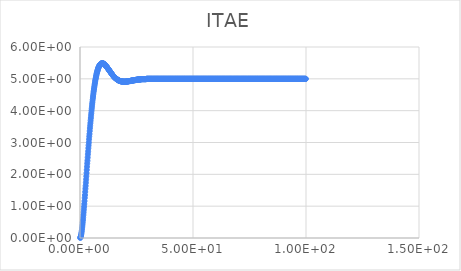
| Category | Series 0 |
|---|---|
| 0.1 | 0.004 |
| 0.2 | 0.016 |
| 0.3 | 0.036 |
| 0.4 | 0.064 |
| 0.5 | 0.098 |
| 0.6 | 0.138 |
| 0.7 | 0.184 |
| 0.8 | 0.236 |
| 0.9 | 0.293 |
| 1.0 | 0.354 |
| 1.1 | 0.42 |
| 1.2 | 0.491 |
| 1.3 | 0.565 |
| 1.4 | 0.642 |
| 1.5 | 0.723 |
| 1.6 | 0.806 |
| 1.7 | 0.892 |
| 1.8 | 0.98 |
| 1.9 | 1.07 |
| 2.0 | 1.16 |
| 2.1 | 1.26 |
| 2.2 | 1.35 |
| 2.3 | 1.45 |
| 2.4 | 1.55 |
| 2.5 | 1.64 |
| 2.6 | 1.74 |
| 2.7 | 1.84 |
| 2.8 | 1.94 |
| 2.9 | 2.04 |
| 3.0 | 2.14 |
| 3.1 | 2.24 |
| 3.2 | 2.34 |
| 3.3 | 2.43 |
| 3.4 | 2.53 |
| 3.5 | 2.63 |
| 3.6 | 2.72 |
| 3.7 | 2.82 |
| 3.8 | 2.91 |
| 3.9 | 3 |
| 4.0 | 3.1 |
| 4.1 | 3.19 |
| 4.2 | 3.27 |
| 4.3 | 3.36 |
| 4.4 | 3.45 |
| 4.5 | 3.53 |
| 4.6 | 3.61 |
| 4.7 | 3.69 |
| 4.8 | 3.77 |
| 4.9 | 3.85 |
| 5.0 | 3.92 |
| 5.1 | 4 |
| 5.2 | 4.07 |
| 5.3 | 4.14 |
| 5.4 | 4.21 |
| 5.5 | 4.27 |
| 5.6 | 4.34 |
| 5.7 | 4.4 |
| 5.8 | 4.46 |
| 5.9 | 4.52 |
| 6.0 | 4.58 |
| 6.1 | 4.63 |
| 6.2 | 4.68 |
| 6.3 | 4.73 |
| 6.4 | 4.78 |
| 6.5 | 4.83 |
| 6.6 | 4.87 |
| 6.7 | 4.92 |
| 6.8 | 4.96 |
| 6.9 | 5 |
| 7.0 | 5.03 |
| 7.1 | 5.07 |
| 7.2 | 5.1 |
| 7.3 | 5.14 |
| 7.4 | 5.17 |
| 7.5 | 5.2 |
| 7.6 | 5.22 |
| 7.7 | 5.25 |
| 7.8 | 5.27 |
| 7.9 | 5.3 |
| 8.0 | 5.32 |
| 8.1 | 5.34 |
| 8.2 | 5.36 |
| 8.3 | 5.37 |
| 8.4 | 5.39 |
| 8.5 | 5.4 |
| 8.6 | 5.42 |
| 8.7 | 5.43 |
| 8.8 | 5.44 |
| 8.9 | 5.45 |
| 9.0 | 5.46 |
| 9.1 | 5.46 |
| 9.2 | 5.47 |
| 9.3 | 5.47 |
| 9.4 | 5.48 |
| 9.5 | 5.48 |
| 9.6 | 5.48 |
| 9.7 | 5.49 |
| 9.8 | 5.49 |
| 9.9 | 5.49 |
| 10.0 | 5.49 |
| 10.1 | 5.48 |
| 10.2 | 5.48 |
| 10.3 | 5.48 |
| 10.4 | 5.48 |
| 10.5 | 5.47 |
| 10.6 | 5.47 |
| 10.7 | 5.46 |
| 10.8 | 5.46 |
| 10.9 | 5.45 |
| 11.0 | 5.44 |
| 11.1 | 5.44 |
| 11.2 | 5.43 |
| 11.3 | 5.42 |
| 11.4 | 5.41 |
| 11.5 | 5.4 |
| 11.6 | 5.39 |
| 11.7 | 5.39 |
| 11.8 | 5.38 |
| 11.9 | 5.37 |
| 12.0 | 5.36 |
| 12.1 | 5.35 |
| 12.2 | 5.34 |
| 12.3 | 5.33 |
| 12.4 | 5.32 |
| 12.5 | 5.31 |
| 12.6 | 5.3 |
| 12.7 | 5.29 |
| 12.8 | 5.28 |
| 12.9 | 5.27 |
| 13.0 | 5.26 |
| 13.1 | 5.25 |
| 13.2 | 5.24 |
| 13.3 | 5.23 |
| 13.4 | 5.22 |
| 13.5 | 5.21 |
| 13.6 | 5.2 |
| 13.7 | 5.19 |
| 13.8 | 5.18 |
| 13.9 | 5.17 |
| 14.0 | 5.16 |
| 14.1 | 5.15 |
| 14.2 | 5.14 |
| 14.3 | 5.13 |
| 14.4 | 5.12 |
| 14.5 | 5.11 |
| 14.6 | 5.1 |
| 14.7 | 5.09 |
| 14.8 | 5.09 |
| 14.9 | 5.08 |
| 15.0 | 5.07 |
| 15.1 | 5.06 |
| 15.2 | 5.05 |
| 15.3 | 5.05 |
| 15.4 | 5.04 |
| 15.5 | 5.03 |
| 15.6 | 5.03 |
| 15.7 | 5.02 |
| 15.8 | 5.01 |
| 15.9 | 5.01 |
| 16.0 | 5 |
| 16.1 | 5 |
| 16.2 | 4.99 |
| 16.3 | 4.99 |
| 16.4 | 4.98 |
| 16.5 | 4.98 |
| 16.6 | 4.97 |
| 16.7 | 4.97 |
| 16.8 | 4.96 |
| 16.9 | 4.96 |
| 17.0 | 4.95 |
| 17.1 | 4.95 |
| 17.2 | 4.95 |
| 17.3 | 4.94 |
| 17.4 | 4.94 |
| 17.5 | 4.94 |
| 17.6 | 4.93 |
| 17.7 | 4.93 |
| 17.8 | 4.93 |
| 17.9 | 4.93 |
| 18.0 | 4.93 |
| 18.1 | 4.92 |
| 18.2 | 4.92 |
| 18.3 | 4.92 |
| 18.4 | 4.92 |
| 18.5 | 4.92 |
| 18.6 | 4.92 |
| 18.7 | 4.92 |
| 18.8 | 4.91 |
| 18.9 | 4.91 |
| 19.0 | 4.91 |
| 19.1 | 4.91 |
| 19.2 | 4.91 |
| 19.3 | 4.91 |
| 19.4 | 4.91 |
| 19.5 | 4.91 |
| 19.6 | 4.91 |
| 19.7 | 4.91 |
| 19.8 | 4.91 |
| 19.9 | 4.91 |
| 20.0 | 4.91 |
| 20.1 | 4.91 |
| 20.2 | 4.91 |
| 20.3 | 4.91 |
| 20.4 | 4.91 |
| 20.5 | 4.91 |
| 20.6 | 4.91 |
| 20.7 | 4.92 |
| 20.8 | 4.92 |
| 20.9 | 4.92 |
| 21.0 | 4.92 |
| 21.1 | 4.92 |
| 21.2 | 4.92 |
| 21.3 | 4.92 |
| 21.4 | 4.92 |
| 21.5 | 4.92 |
| 21.6 | 4.93 |
| 21.7 | 4.93 |
| 21.8 | 4.93 |
| 21.9 | 4.93 |
| 22.0 | 4.93 |
| 22.1 | 4.93 |
| 22.2 | 4.93 |
| 22.3 | 4.93 |
| 22.4 | 4.94 |
| 22.5 | 4.94 |
| 22.6 | 4.94 |
| 22.7 | 4.94 |
| 22.8 | 4.94 |
| 22.9 | 4.94 |
| 23.0 | 4.94 |
| 23.1 | 4.95 |
| 23.2 | 4.95 |
| 23.3 | 4.95 |
| 23.4 | 4.95 |
| 23.5 | 4.95 |
| 23.6 | 4.95 |
| 23.7 | 4.95 |
| 23.8 | 4.95 |
| 23.9 | 4.96 |
| 24.0 | 4.96 |
| 24.1 | 4.96 |
| 24.2 | 4.96 |
| 24.3 | 4.96 |
| 24.4 | 4.96 |
| 24.5 | 4.96 |
| 24.6 | 4.96 |
| 24.7 | 4.97 |
| 24.8 | 4.97 |
| 24.9 | 4.97 |
| 25.0 | 4.97 |
| 25.1 | 4.97 |
| 25.2 | 4.97 |
| 25.3 | 4.97 |
| 25.4 | 4.97 |
| 25.5 | 4.97 |
| 25.6 | 4.98 |
| 25.7 | 4.98 |
| 25.8 | 4.98 |
| 25.9 | 4.98 |
| 26.0 | 4.98 |
| 26.1 | 4.98 |
| 26.2 | 4.98 |
| 26.3 | 4.98 |
| 26.4 | 4.98 |
| 26.5 | 4.98 |
| 26.6 | 4.98 |
| 26.7 | 4.98 |
| 26.8 | 4.98 |
| 26.9 | 4.99 |
| 27.0 | 4.99 |
| 27.1 | 4.99 |
| 27.2 | 4.99 |
| 27.3 | 4.99 |
| 27.4 | 4.99 |
| 27.5 | 4.99 |
| 27.6 | 4.99 |
| 27.7 | 4.99 |
| 27.8 | 4.99 |
| 27.9 | 4.99 |
| 28.0 | 4.99 |
| 28.1 | 4.99 |
| 28.2 | 4.99 |
| 28.3 | 4.99 |
| 28.4 | 4.99 |
| 28.5 | 4.99 |
| 28.6 | 4.99 |
| 28.7 | 4.99 |
| 28.8 | 4.99 |
| 28.9 | 4.99 |
| 29.0 | 4.99 |
| 29.1 | 4.99 |
| 29.2 | 4.99 |
| 29.3 | 4.99 |
| 29.4 | 5 |
| 29.5 | 5 |
| 29.6 | 5 |
| 29.7 | 5 |
| 29.8 | 5 |
| 29.9 | 5 |
| 30.0 | 5 |
| 30.1 | 5 |
| 30.2 | 5 |
| 30.3 | 5 |
| 30.4 | 5 |
| 30.5 | 5 |
| 30.6 | 5 |
| 30.7 | 5 |
| 30.8 | 5 |
| 30.9 | 5 |
| 31.0 | 5 |
| 31.1 | 5 |
| 31.2 | 5 |
| 31.3 | 5 |
| 31.4 | 5 |
| 31.5 | 5 |
| 31.6 | 5 |
| 31.7 | 5 |
| 31.8 | 5 |
| 31.9 | 5 |
| 32.0 | 5 |
| 32.1 | 5 |
| 32.2 | 5 |
| 32.3 | 5 |
| 32.4 | 5 |
| 32.5 | 5 |
| 32.6 | 5 |
| 32.7 | 5 |
| 32.8 | 5 |
| 32.9 | 5 |
| 33.0 | 5 |
| 33.1 | 5 |
| 33.2 | 5 |
| 33.3 | 5 |
| 33.4 | 5 |
| 33.5 | 5 |
| 33.6 | 5 |
| 33.7 | 5 |
| 33.8 | 5 |
| 33.9 | 5 |
| 34.0 | 5 |
| 34.1 | 5 |
| 34.2 | 5 |
| 34.3 | 5 |
| 34.4 | 5 |
| 34.5 | 5 |
| 34.6 | 5 |
| 34.7 | 5 |
| 34.8 | 5 |
| 34.9 | 5 |
| 35.0 | 5 |
| 35.1 | 5 |
| 35.2 | 5 |
| 35.3 | 5 |
| 35.4 | 5 |
| 35.5 | 5 |
| 35.6 | 5 |
| 35.7 | 5 |
| 35.8 | 5 |
| 35.9 | 5 |
| 36.0 | 5 |
| 36.1 | 5 |
| 36.2 | 5 |
| 36.3 | 5 |
| 36.4 | 5 |
| 36.5 | 5 |
| 36.6 | 5 |
| 36.7 | 5 |
| 36.8 | 5 |
| 36.9 | 5 |
| 37.0 | 5 |
| 37.1 | 5 |
| 37.2 | 5 |
| 37.3 | 5 |
| 37.4 | 5 |
| 37.5 | 5 |
| 37.6 | 5 |
| 37.7 | 5 |
| 37.8 | 5 |
| 37.9 | 5 |
| 38.0 | 5 |
| 38.1 | 5 |
| 38.2 | 5 |
| 38.3 | 5 |
| 38.4 | 5 |
| 38.5 | 5 |
| 38.6 | 5 |
| 38.7 | 5 |
| 38.8 | 5 |
| 38.9 | 5 |
| 39.0 | 5 |
| 39.1 | 5 |
| 39.2 | 5 |
| 39.3 | 5 |
| 39.4 | 5 |
| 39.5 | 5 |
| 39.6 | 5 |
| 39.7 | 5 |
| 39.8 | 5 |
| 39.9 | 5 |
| 40.0 | 5 |
| 40.1 | 5 |
| 40.2 | 5 |
| 40.3 | 5 |
| 40.4 | 5 |
| 40.5 | 5 |
| 40.6 | 5 |
| 40.7 | 5 |
| 40.8 | 5 |
| 40.9 | 5 |
| 41.0 | 5 |
| 41.1 | 5 |
| 41.2 | 5 |
| 41.3 | 5 |
| 41.4 | 5 |
| 41.5 | 5 |
| 41.6 | 5 |
| 41.7 | 5 |
| 41.8 | 5 |
| 41.9 | 5 |
| 42.0 | 5 |
| 42.1 | 5 |
| 42.2 | 5 |
| 42.3 | 5 |
| 42.4 | 5 |
| 42.5 | 5 |
| 42.6 | 5 |
| 42.7 | 5 |
| 42.8 | 5 |
| 42.9 | 5 |
| 43.0 | 5 |
| 43.1 | 5 |
| 43.2 | 5 |
| 43.3 | 5 |
| 43.4 | 5 |
| 43.5 | 5 |
| 43.6 | 5 |
| 43.7 | 5 |
| 43.8 | 5 |
| 43.9 | 5 |
| 44.0 | 5 |
| 44.1 | 5 |
| 44.2 | 5 |
| 44.3 | 5 |
| 44.4 | 5 |
| 44.5 | 5 |
| 44.6 | 5 |
| 44.7 | 5 |
| 44.8 | 5 |
| 44.9 | 5 |
| 45.0 | 5 |
| 45.1 | 5 |
| 45.2 | 5 |
| 45.3 | 5 |
| 45.4 | 5 |
| 45.5 | 5 |
| 45.6 | 5 |
| 45.7 | 5 |
| 45.8 | 5 |
| 45.9 | 5 |
| 46.0 | 5 |
| 46.1 | 5 |
| 46.2 | 5 |
| 46.3 | 5 |
| 46.4 | 5 |
| 46.5 | 5 |
| 46.6 | 5 |
| 46.7 | 5 |
| 46.8 | 5 |
| 46.9 | 5 |
| 47.0 | 5 |
| 47.1 | 5 |
| 47.2 | 5 |
| 47.3 | 5 |
| 47.4 | 5 |
| 47.5 | 5 |
| 47.6 | 5 |
| 47.7 | 5 |
| 47.8 | 5 |
| 47.9 | 5 |
| 48.0 | 5 |
| 48.1 | 5 |
| 48.2 | 5 |
| 48.3 | 5 |
| 48.4 | 5 |
| 48.5 | 5 |
| 48.6 | 5 |
| 48.7 | 5 |
| 48.8 | 5 |
| 48.9 | 5 |
| 49.0 | 5 |
| 49.1 | 5 |
| 49.2 | 5 |
| 49.3 | 5 |
| 49.4 | 5 |
| 49.5 | 5 |
| 49.6 | 5 |
| 49.7 | 5 |
| 49.8 | 5 |
| 49.9 | 5 |
| 50.0 | 5 |
| 50.1 | 5 |
| 50.2 | 5 |
| 50.3 | 5 |
| 50.4 | 5 |
| 50.5 | 5 |
| 50.6 | 5 |
| 50.7 | 5 |
| 50.8 | 5 |
| 50.9 | 5 |
| 51.0 | 5 |
| 51.1 | 5 |
| 51.2 | 5 |
| 51.3 | 5 |
| 51.4 | 5 |
| 51.5 | 5 |
| 51.6 | 5 |
| 51.7 | 5 |
| 51.8 | 5 |
| 51.9 | 5 |
| 52.0 | 5 |
| 52.1 | 5 |
| 52.2 | 5 |
| 52.3 | 5 |
| 52.4 | 5 |
| 52.5 | 5 |
| 52.6 | 5 |
| 52.7 | 5 |
| 52.8 | 5 |
| 52.9 | 5 |
| 53.0 | 5 |
| 53.1 | 5 |
| 53.2 | 5 |
| 53.3 | 5 |
| 53.4 | 5 |
| 53.5 | 5 |
| 53.6 | 5 |
| 53.7 | 5 |
| 53.8 | 5 |
| 53.9 | 5 |
| 54.0 | 5 |
| 54.1 | 5 |
| 54.2 | 5 |
| 54.3 | 5 |
| 54.4 | 5 |
| 54.5 | 5 |
| 54.6 | 5 |
| 54.7 | 5 |
| 54.8 | 5 |
| 54.9 | 5 |
| 55.0 | 5 |
| 55.1 | 5 |
| 55.2 | 5 |
| 55.3 | 5 |
| 55.4 | 5 |
| 55.5 | 5 |
| 55.6 | 5 |
| 55.7 | 5 |
| 55.8 | 5 |
| 55.9 | 5 |
| 56.0 | 5 |
| 56.1 | 5 |
| 56.2 | 5 |
| 56.3 | 5 |
| 56.4 | 5 |
| 56.5 | 5 |
| 56.6 | 5 |
| 56.7 | 5 |
| 56.8 | 5 |
| 56.9 | 5 |
| 57.0 | 5 |
| 57.1 | 5 |
| 57.2 | 5 |
| 57.3 | 5 |
| 57.4 | 5 |
| 57.5 | 5 |
| 57.6 | 5 |
| 57.7 | 5 |
| 57.8 | 5 |
| 57.9 | 5 |
| 58.0 | 5 |
| 58.1 | 5 |
| 58.2 | 5 |
| 58.3 | 5 |
| 58.4 | 5 |
| 58.5 | 5 |
| 58.6 | 5 |
| 58.7 | 5 |
| 58.8 | 5 |
| 58.9 | 5 |
| 59.0 | 5 |
| 59.1 | 5 |
| 59.2 | 5 |
| 59.3 | 5 |
| 59.4 | 5 |
| 59.5 | 5 |
| 59.6 | 5 |
| 59.7 | 5 |
| 59.8 | 5 |
| 59.9 | 5 |
| 60.0 | 5 |
| 60.1 | 5 |
| 60.2 | 5 |
| 60.3 | 5 |
| 60.4 | 5 |
| 60.5 | 5 |
| 60.6 | 5 |
| 60.7 | 5 |
| 60.8 | 5 |
| 60.9 | 5 |
| 61.0 | 5 |
| 61.1 | 5 |
| 61.2 | 5 |
| 61.3 | 5 |
| 61.4 | 5 |
| 61.5 | 5 |
| 61.6 | 5 |
| 61.7 | 5 |
| 61.8 | 5 |
| 61.9 | 5 |
| 62.0 | 5 |
| 62.1 | 5 |
| 62.2 | 5 |
| 62.3 | 5 |
| 62.4 | 5 |
| 62.5 | 5 |
| 62.6 | 5 |
| 62.7 | 5 |
| 62.8 | 5 |
| 62.9 | 5 |
| 63.0 | 5 |
| 63.1 | 5 |
| 63.2 | 5 |
| 63.3 | 5 |
| 63.4 | 5 |
| 63.5 | 5 |
| 63.6 | 5 |
| 63.7 | 5 |
| 63.8 | 5 |
| 63.9 | 5 |
| 64.0 | 5 |
| 64.1 | 5 |
| 64.2 | 5 |
| 64.3 | 5 |
| 64.4 | 5 |
| 64.5 | 5 |
| 64.6 | 5 |
| 64.7 | 5 |
| 64.8 | 5 |
| 64.9 | 5 |
| 65.0 | 5 |
| 65.1 | 5 |
| 65.2 | 5 |
| 65.3 | 5 |
| 65.4 | 5 |
| 65.5 | 5 |
| 65.6 | 5 |
| 65.7 | 5 |
| 65.8 | 5 |
| 65.9 | 5 |
| 66.0 | 5 |
| 66.1 | 5 |
| 66.2 | 5 |
| 66.3 | 5 |
| 66.4 | 5 |
| 66.5 | 5 |
| 66.6 | 5 |
| 66.7 | 5 |
| 66.8 | 5 |
| 66.9 | 5 |
| 67.0 | 5 |
| 67.1 | 5 |
| 67.2 | 5 |
| 67.3 | 5 |
| 67.4 | 5 |
| 67.5 | 5 |
| 67.6 | 5 |
| 67.7 | 5 |
| 67.8 | 5 |
| 67.9 | 5 |
| 68.0 | 5 |
| 68.1 | 5 |
| 68.2 | 5 |
| 68.3 | 5 |
| 68.4 | 5 |
| 68.5 | 5 |
| 68.6 | 5 |
| 68.7 | 5 |
| 68.8 | 5 |
| 68.9 | 5 |
| 69.0 | 5 |
| 69.1 | 5 |
| 69.2 | 5 |
| 69.3 | 5 |
| 69.4 | 5 |
| 69.5 | 5 |
| 69.6 | 5 |
| 69.7 | 5 |
| 69.8 | 5 |
| 69.9 | 5 |
| 70.0 | 5 |
| 70.1 | 5 |
| 70.2 | 5 |
| 70.3 | 5 |
| 70.4 | 5 |
| 70.5 | 5 |
| 70.6 | 5 |
| 70.7 | 5 |
| 70.8 | 5 |
| 70.9 | 5 |
| 71.0 | 5 |
| 71.1 | 5 |
| 71.2 | 5 |
| 71.3 | 5 |
| 71.4 | 5 |
| 71.5 | 5 |
| 71.6 | 5 |
| 71.7 | 5 |
| 71.8 | 5 |
| 71.9 | 5 |
| 72.0 | 5 |
| 72.1 | 5 |
| 72.2 | 5 |
| 72.3 | 5 |
| 72.4 | 5 |
| 72.5 | 5 |
| 72.6 | 5 |
| 72.7 | 5 |
| 72.8 | 5 |
| 72.9 | 5 |
| 73.0 | 5 |
| 73.1 | 5 |
| 73.2 | 5 |
| 73.3 | 5 |
| 73.4 | 5 |
| 73.5 | 5 |
| 73.6 | 5 |
| 73.7 | 5 |
| 73.8 | 5 |
| 73.9 | 5 |
| 74.0 | 5 |
| 74.1 | 5 |
| 74.2 | 5 |
| 74.3 | 5 |
| 74.4 | 5 |
| 74.5 | 5 |
| 74.6 | 5 |
| 74.7 | 5 |
| 74.8 | 5 |
| 74.9 | 5 |
| 75.0 | 5 |
| 75.1 | 5 |
| 75.2 | 5 |
| 75.3 | 5 |
| 75.4 | 5 |
| 75.5 | 5 |
| 75.6 | 5 |
| 75.7 | 5 |
| 75.8 | 5 |
| 75.9 | 5 |
| 76.0 | 5 |
| 76.1 | 5 |
| 76.2 | 5 |
| 76.3 | 5 |
| 76.4 | 5 |
| 76.5 | 5 |
| 76.6 | 5 |
| 76.7 | 5 |
| 76.8 | 5 |
| 76.9 | 5 |
| 77.0 | 5 |
| 77.1 | 5 |
| 77.2 | 5 |
| 77.3 | 5 |
| 77.4 | 5 |
| 77.5 | 5 |
| 77.6 | 5 |
| 77.7 | 5 |
| 77.8 | 5 |
| 77.9 | 5 |
| 78.0 | 5 |
| 78.1 | 5 |
| 78.2 | 5 |
| 78.3 | 5 |
| 78.4 | 5 |
| 78.5 | 5 |
| 78.6 | 5 |
| 78.7 | 5 |
| 78.8 | 5 |
| 78.9 | 5 |
| 79.0 | 5 |
| 79.1 | 5 |
| 79.2 | 5 |
| 79.3 | 5 |
| 79.4 | 5 |
| 79.5 | 5 |
| 79.6 | 5 |
| 79.7 | 5 |
| 79.8 | 5 |
| 79.9 | 5 |
| 80.0 | 5 |
| 80.1 | 5 |
| 80.2 | 5 |
| 80.3 | 5 |
| 80.4 | 5 |
| 80.5 | 5 |
| 80.6 | 5 |
| 80.7 | 5 |
| 80.8 | 5 |
| 80.9 | 5 |
| 81.0 | 5 |
| 81.1 | 5 |
| 81.2 | 5 |
| 81.3 | 5 |
| 81.4 | 5 |
| 81.5 | 5 |
| 81.6 | 5 |
| 81.7 | 5 |
| 81.8 | 5 |
| 81.9 | 5 |
| 82.0 | 5 |
| 82.1 | 5 |
| 82.2 | 5 |
| 82.3 | 5 |
| 82.4 | 5 |
| 82.5 | 5 |
| 82.6 | 5 |
| 82.7 | 5 |
| 82.8 | 5 |
| 82.9 | 5 |
| 83.0 | 5 |
| 83.1 | 5 |
| 83.2 | 5 |
| 83.3 | 5 |
| 83.4 | 5 |
| 83.5 | 5 |
| 83.6 | 5 |
| 83.7 | 5 |
| 83.8 | 5 |
| 83.9 | 5 |
| 84.0 | 5 |
| 84.1 | 5 |
| 84.2 | 5 |
| 84.3 | 5 |
| 84.4 | 5 |
| 84.5 | 5 |
| 84.6 | 5 |
| 84.7 | 5 |
| 84.8 | 5 |
| 84.9 | 5 |
| 85.0 | 5 |
| 85.1 | 5 |
| 85.2 | 5 |
| 85.3 | 5 |
| 85.4 | 5 |
| 85.5 | 5 |
| 85.6 | 5 |
| 85.7 | 5 |
| 85.8 | 5 |
| 85.9 | 5 |
| 86.0 | 5 |
| 86.1 | 5 |
| 86.2 | 5 |
| 86.3 | 5 |
| 86.4 | 5 |
| 86.5 | 5 |
| 86.6 | 5 |
| 86.7 | 5 |
| 86.8 | 5 |
| 86.9 | 5 |
| 87.0 | 5 |
| 87.1 | 5 |
| 87.2 | 5 |
| 87.3 | 5 |
| 87.4 | 5 |
| 87.5 | 5 |
| 87.6 | 5 |
| 87.7 | 5 |
| 87.8 | 5 |
| 87.9 | 5 |
| 88.0 | 5 |
| 88.1 | 5 |
| 88.2 | 5 |
| 88.3 | 5 |
| 88.4 | 5 |
| 88.5 | 5 |
| 88.6 | 5 |
| 88.7 | 5 |
| 88.8 | 5 |
| 88.9 | 5 |
| 89.0 | 5 |
| 89.1 | 5 |
| 89.2 | 5 |
| 89.3 | 5 |
| 89.4 | 5 |
| 89.5 | 5 |
| 89.6 | 5 |
| 89.7 | 5 |
| 89.8 | 5 |
| 89.9 | 5 |
| 90.0 | 5 |
| 90.1 | 5 |
| 90.2 | 5 |
| 90.3 | 5 |
| 90.4 | 5 |
| 90.5 | 5 |
| 90.6 | 5 |
| 90.7 | 5 |
| 90.8 | 5 |
| 90.9 | 5 |
| 91.0 | 5 |
| 91.1 | 5 |
| 91.2 | 5 |
| 91.3 | 5 |
| 91.4 | 5 |
| 91.5 | 5 |
| 91.6 | 5 |
| 91.7 | 5 |
| 91.8 | 5 |
| 91.9 | 5 |
| 92.0 | 5 |
| 92.1 | 5 |
| 92.2 | 5 |
| 92.3 | 5 |
| 92.4 | 5 |
| 92.5 | 5 |
| 92.6 | 5 |
| 92.7 | 5 |
| 92.8 | 5 |
| 92.9 | 5 |
| 93.0 | 5 |
| 93.1 | 5 |
| 93.2 | 5 |
| 93.3 | 5 |
| 93.4 | 5 |
| 93.5 | 5 |
| 93.6 | 5 |
| 93.7 | 5 |
| 93.8 | 5 |
| 93.9 | 5 |
| 94.0 | 5 |
| 94.1 | 5 |
| 94.2 | 5 |
| 94.3 | 5 |
| 94.4 | 5 |
| 94.5 | 5 |
| 94.6 | 5 |
| 94.7 | 5 |
| 94.8 | 5 |
| 94.9 | 5 |
| 95.0 | 5 |
| 95.1 | 5 |
| 95.2 | 5 |
| 95.3 | 5 |
| 95.4 | 5 |
| 95.5 | 5 |
| 95.6 | 5 |
| 95.7 | 5 |
| 95.8 | 5 |
| 95.9 | 5 |
| 96.0 | 5 |
| 96.1 | 5 |
| 96.2 | 5 |
| 96.3 | 5 |
| 96.4 | 5 |
| 96.5 | 5 |
| 96.6 | 5 |
| 96.7 | 5 |
| 96.8 | 5 |
| 96.9 | 5 |
| 97.0 | 5 |
| 97.1 | 5 |
| 97.2 | 5 |
| 97.3 | 5 |
| 97.4 | 5 |
| 97.5 | 5 |
| 97.6 | 5 |
| 97.7 | 5 |
| 97.8 | 5 |
| 97.9 | 5 |
| 98.0 | 5 |
| 98.1 | 5 |
| 98.2 | 5 |
| 98.3 | 5 |
| 98.4 | 5 |
| 98.5 | 5 |
| 98.6 | 5 |
| 98.7 | 5 |
| 98.8 | 5 |
| 98.9 | 5 |
| 99.0 | 5 |
| 99.1 | 5 |
| 99.2 | 5 |
| 99.3 | 5 |
| 99.4 | 5 |
| 99.5 | 5 |
| 99.6 | 5 |
| 99.7 | 5 |
| 99.8 | 5 |
| 99.9 | 5 |